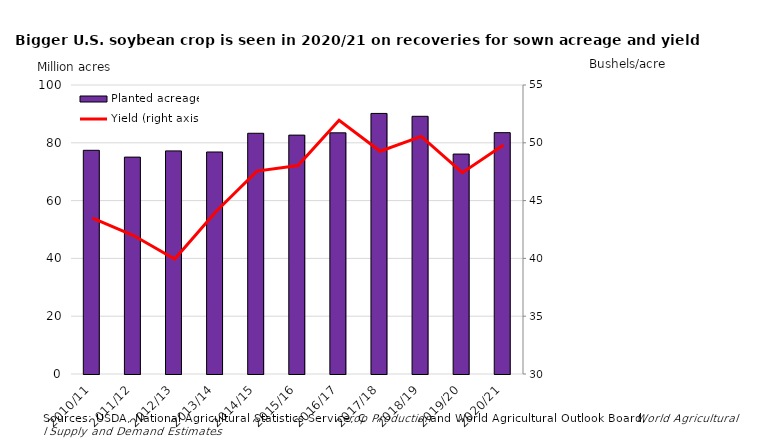
| Category | Planted |
|---|---|
| 2010/11 | 77.404 |
| 2011/12 | 75.046 |
| 2012/13 | 77.198 |
| 2013/14 | 76.82 |
| 2014/15 | 83.296 |
| 2015/16 | 82.66 |
| 2016/17 | 83.453 |
| 2017/18 | 90.162 |
| 2018/19 | 89.167 |
| 2019/20 | 76.1 |
| 2020/21 | 83.51 |